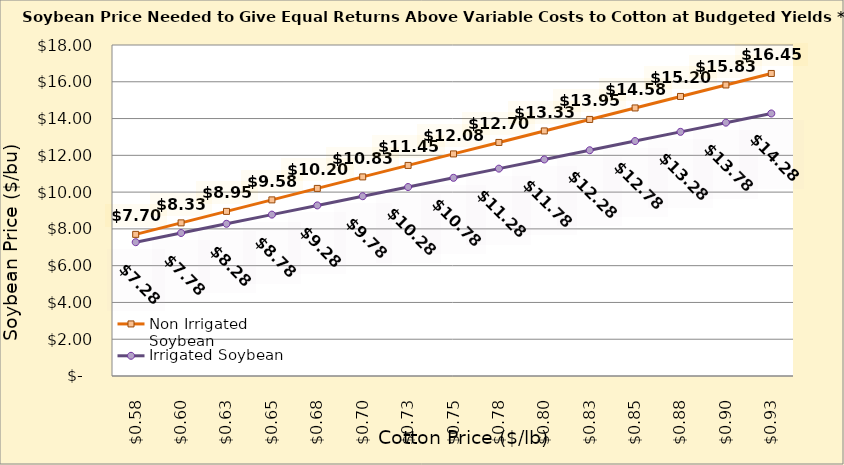
| Category | Non Irrigated Soybean | Irrigated Soybean |
|---|---|---|
| 0.5749999999999998 | 7.702 | 7.277 |
| 0.5999999999999999 | 8.327 | 7.777 |
| 0.6249999999999999 | 8.952 | 8.277 |
| 0.6499999999999999 | 9.577 | 8.777 |
| 0.6749999999999999 | 10.202 | 9.277 |
| 0.7 | 10.827 | 9.777 |
| 0.725 | 11.452 | 10.277 |
| 0.75 | 12.077 | 10.777 |
| 0.775 | 12.702 | 11.277 |
| 0.8 | 13.327 | 11.777 |
| 0.8250000000000001 | 13.952 | 12.277 |
| 0.8500000000000001 | 14.577 | 12.777 |
| 0.8750000000000001 | 15.202 | 13.277 |
| 0.9000000000000001 | 15.827 | 13.777 |
| 0.9250000000000002 | 16.452 | 14.277 |